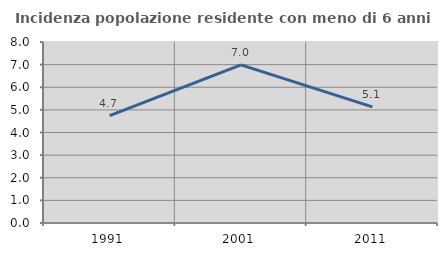
| Category | Incidenza popolazione residente con meno di 6 anni |
|---|---|
| 1991.0 | 4.749 |
| 2001.0 | 6.989 |
| 2011.0 | 5.135 |